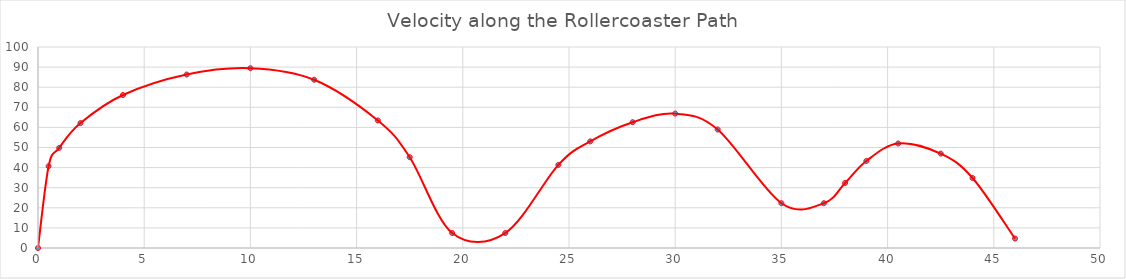
| Category | v(x)  [in/s] |
|---|---|
| 0.0 | 0 |
| 0.5 | 40.685 |
| 1.0 | 49.828 |
| 2.0 | 62.147 |
| 4.0 | 76.114 |
| 7.0 | 86.305 |
| 10.0 | 89.444 |
| 13.0 | 83.709 |
| 16.0 | 63.464 |
| 17.5 | 45.182 |
| 19.5 | 7.428 |
| 22.0 | 7.428 |
| 24.5 | 41.357 |
| 26.0 | 53.046 |
| 28.0 | 62.589 |
| 30.0 | 66.851 |
| 32.0 | 58.957 |
| 35.0 | 22.284 |
| 37.0 | 22.284 |
| 38.0 | 32.378 |
| 39.0 | 43.312 |
| 40.5 | 51.996 |
| 42.5 | 46.978 |
| 44.0 | 34.84 |
| 46.0 | 4.698 |